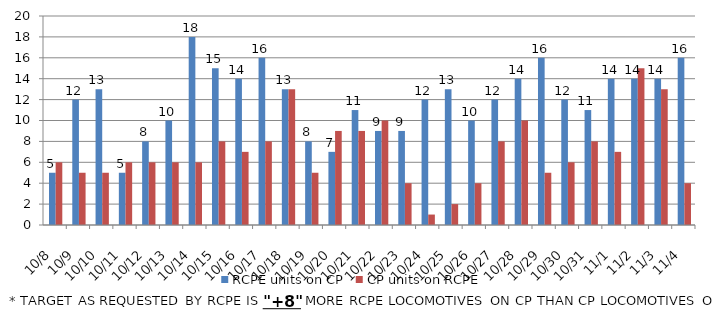
| Category | RCPE units on CP | CP units on RCPE |
|---|---|---|
| 2014-10-08 | 5 | 6 |
| 2014-10-09 | 12 | 5 |
| 2014-10-10 | 13 | 5 |
| 2014-10-11 | 5 | 6 |
| 2014-10-12 | 8 | 6 |
| 2014-10-13 | 10 | 6 |
| 2014-10-14 | 18 | 6 |
| 2014-10-15 | 15 | 8 |
| 2014-10-16 | 14 | 7 |
| 2014-10-17 | 16 | 8 |
| 2014-10-18 | 13 | 13 |
| 2014-10-19 | 8 | 5 |
| 2014-10-20 | 7 | 9 |
| 2014-10-21 | 11 | 9 |
| 2014-10-22 | 9 | 10 |
| 2014-10-23 | 9 | 4 |
| 2014-10-24 | 12 | 1 |
| 2014-10-25 | 13 | 2 |
| 2014-10-26 | 10 | 4 |
| 2014-10-27 | 12 | 8 |
| 2014-10-28 | 14 | 10 |
| 2014-10-29 | 16 | 5 |
| 2014-10-30 | 12 | 6 |
| 2014-10-31 | 11 | 8 |
| 2014-11-01 | 14 | 7 |
| 2014-11-02 | 14 | 15 |
| 2014-11-03 | 14 | 13 |
| 2014-11-04 | 16 | 4 |